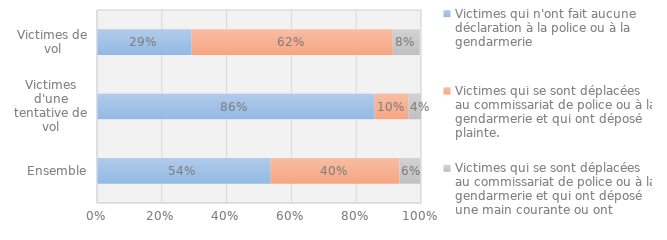
| Category | Victimes qui n'ont fait aucune déclaration à la police ou à la gendarmerie | Victimes qui se sont déplacées au commissariat de police ou à la gendarmerie et qui ont déposé plainte. | Victimes qui se sont déplacées au commissariat de police ou à la gendarmerie et qui ont déposé une main courante ou ont abandonné leur démarche sur place |
|---|---|---|---|
| Ensemble | 0.536 | 0.397 | 0.064 |
| Victimes d'une tentative de vol | 0.857 | 0.104 | 0.039 |
| Victimes de vol | 0.292 | 0.621 | 0.083 |